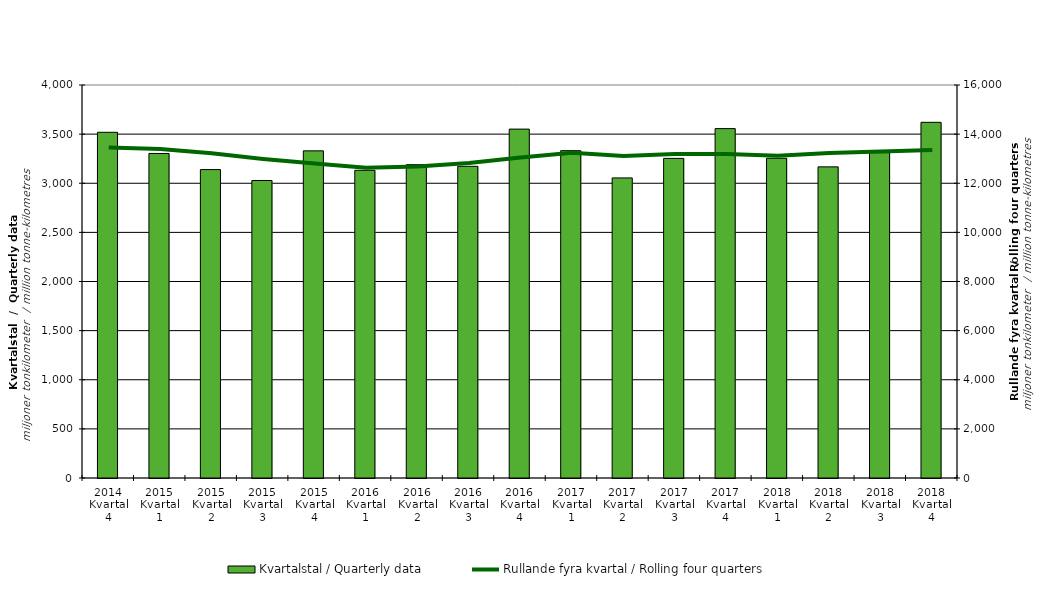
| Category | Kvartalstal / Quarterly data |
|---|---|
| 2014 Kvartal 4 | 3518.717 |
| 2015 Kvartal 1 | 3303.252 |
| 2015 Kvartal 2 | 3139.108 |
| 2015 Kvartal 3 | 3027.85 |
| 2015 Kvartal 4 | 3329.686 |
| 2016 Kvartal 1 | 3131.908 |
| 2016 Kvartal 2 | 3189.179 |
| 2016 Kvartal 3 | 3172.4 |
| 2016 Kvartal 4 | 3550.917 |
| 2017 Kvartal 1 | 3331.468 |
| 2017 Kvartal 2 | 3054.243 |
| 2017 Kvartal 3 | 3253.049 |
| 2017 Kvartal 4 | 3556.029 |
| 2018 Kvartal 1 | 3254.266 |
| 2018 Kvartal 2 | 3166.77 |
| 2018 Kvartal 3 | 3312.011 |
| 2018 Kvartal 4 | 3620.142 |